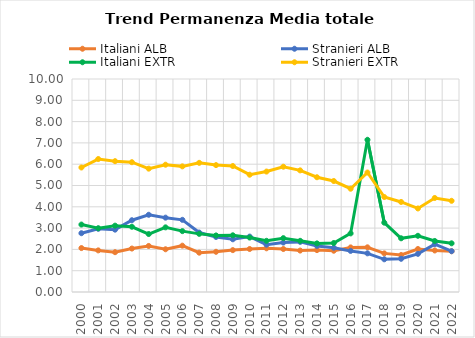
| Category | Italiani ALB | Stranieri ALB | Italiani EXTR | Stranieri EXTR |
|---|---|---|---|---|
| 2000.0 | 2.063 | 2.76 | 3.166 | 5.845 |
| 2001.0 | 1.954 | 2.968 | 2.995 | 6.242 |
| 2002.0 | 1.87 | 2.927 | 3.115 | 6.142 |
| 2003.0 | 2.04 | 3.37 | 3.063 | 6.093 |
| 2004.0 | 2.162 | 3.625 | 2.721 | 5.791 |
| 2005.0 | 2.006 | 3.491 | 3.035 | 5.976 |
| 2006.0 | 2.175 | 3.389 | 2.857 | 5.898 |
| 2007.0 | 1.846 | 2.792 | 2.73 | 6.064 |
| 2008.0 | 1.888 | 2.585 | 2.655 | 5.958 |
| 2009.0 | 1.966 | 2.475 | 2.662 | 5.915 |
| 2010.0 | 2.019 | 2.602 | 2.556 | 5.507 |
| 2011.0 | 2.052 | 2.222 | 2.403 | 5.654 |
| 2012.0 | 2.018 | 2.321 | 2.528 | 5.882 |
| 2013.0 | 1.945 | 2.353 | 2.403 | 5.71 |
| 2014.0 | 1.967 | 2.164 | 2.281 | 5.387 |
| 2015.0 | 1.938 | 2.078 | 2.299 | 5.21 |
| 2016.0 | 2.093 | 1.93 | 2.751 | 4.848 |
| 2017.0 | 2.098 | 1.815 | 7.146 | 5.61 |
| 2018.0 | 1.813 | 1.535 | 3.255 | 4.459 |
| 2019.0 | 1.736 | 1.559 | 2.521 | 4.227 |
| 2020.0 | 2.018 | 1.79 | 2.638 | 3.922 |
| 2021.0 | 1.949 | 2.244 | 2.396 | 4.415 |
| 2022.0 | 1.914 | 1.916 | 2.286 | 4.281 |